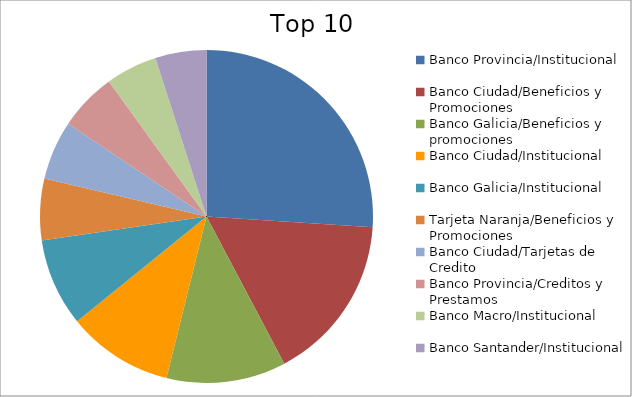
| Category | Series 0 |
|---|---|
| Banco Provincia/Institucional | 17.6 |
| Banco Ciudad/Beneficios y Promociones | 10.98 |
| Banco Galicia/Beneficios y promociones | 7.85 |
| Banco Ciudad/Institucional | 6.97 |
| Banco Galicia/Institucional | 5.77 |
| Tarjeta Naranja/Beneficios y Promociones | 4.03 |
| Banco Ciudad/Tarjetas de Credito | 3.89 |
| Banco Provincia/Creditos y Prestamos | 3.8 |
| Banco Macro/Institucional | 3.38 |
| Banco Santander/Institucional | 3.36 |